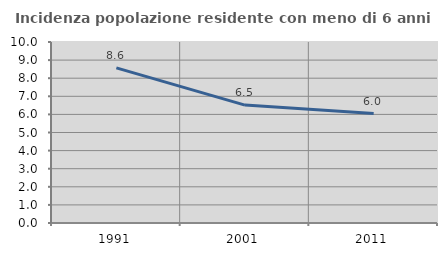
| Category | Incidenza popolazione residente con meno di 6 anni |
|---|---|
| 1991.0 | 8.572 |
| 2001.0 | 6.516 |
| 2011.0 | 6.043 |